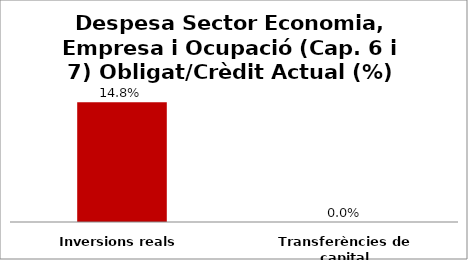
| Category | Series 0 |
|---|---|
| Inversions reals | 0.148 |
| Transferències de capital | 0 |